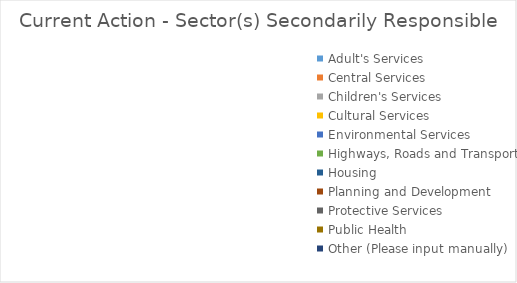
| Category | Series 0 |
|---|---|
| Adult's Services | 0 |
| Central Services  | 0 |
| Children's Services | 0 |
| Cultural Services | 0 |
| Environmental Services | 0 |
| Highways, Roads and Transport | 0 |
| Housing | 0 |
| Planning and Development | 0 |
| Protective Services | 0 |
| Public Health | 0 |
| Other (Please input manually) | 0 |